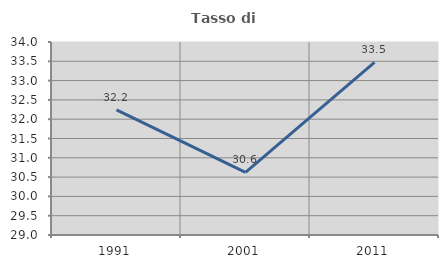
| Category | Tasso di occupazione   |
|---|---|
| 1991.0 | 32.242 |
| 2001.0 | 30.623 |
| 2011.0 | 33.47 |